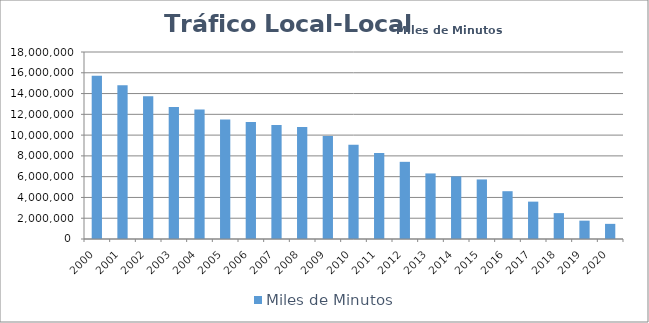
| Category | Miles de Minutos |
|---|---|
| 2000 | 15708021.692 |
| 2001 | 14792112.011 |
| 2002 | 13741512.578 |
| 2003 | 12697840.356 |
| 2004 | 12471681.103 |
| 2005 | 11497364.137 |
| 2006 | 11250082.402 |
| 2007 | 10981107.318 |
| 2008 | 10792163.023 |
| 2009 | 9925576.314 |
| 2010 | 9070767.124 |
| 2011 | 8283065.602 |
| 2012 | 7428037.584 |
| 2013 | 6310456.472 |
| 2014 | 6026527.532 |
| 2015 | 5731826.348 |
| 2016 | 4599625.362 |
| 2017 | 3595888.694 |
| 2018 | 2491247.166 |
| 2019 | 1765464.035 |
| 2020 | 1457202.189 |